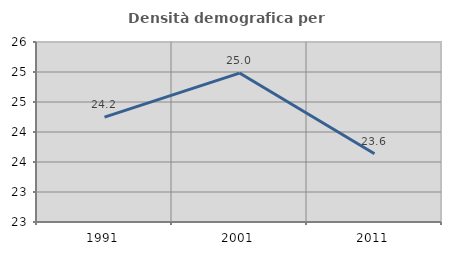
| Category | Densità demografica |
|---|---|
| 1991.0 | 24.248 |
| 2001.0 | 24.982 |
| 2011.0 | 23.637 |